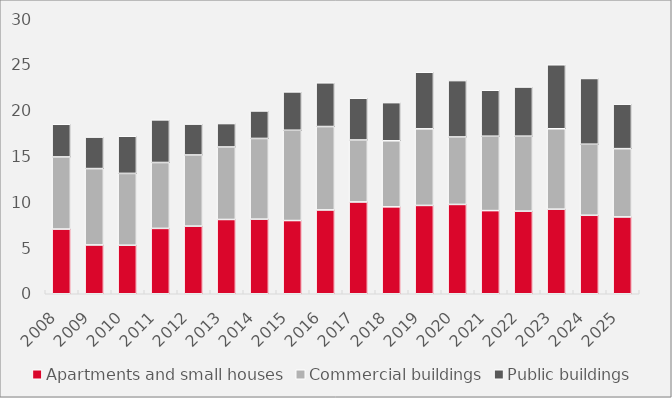
| Category | Apartments and small houses | Commercial buildings | Public buildings |
|---|---|---|---|
| 2008.0 | 7.055 | 7.871 | 3.563 |
| 2009.0 | 5.323 | 8.333 | 3.434 |
| 2010.0 | 5.291 | 7.838 | 4.055 |
| 2011.0 | 7.13 | 7.189 | 4.649 |
| 2012.0 | 7.375 | 7.764 | 3.368 |
| 2013.0 | 8.102 | 7.907 | 2.558 |
| 2014.0 | 8.136 | 8.806 | 2.998 |
| 2015.0 | 7.986 | 9.849 | 4.184 |
| 2016.0 | 9.142 | 9.101 | 4.769 |
| 2017.0 | 10.013 | 6.762 | 4.558 |
| 2018.0 | 9.48 | 7.207 | 4.163 |
| 2019.0 | 9.634 | 8.358 | 6.171 |
| 2020.0 | 9.744 | 7.361 | 6.149 |
| 2021.0 | 9.07 | 8.115 | 5.016 |
| 2022.0 | 9.008 | 8.184 | 5.36 |
| 2023.0 | 9.224 | 8.775 | 6.98 |
| 2024.0 | 8.561 | 7.752 | 7.172 |
| 2025.0 | 8.381 | 7.447 | 4.85 |